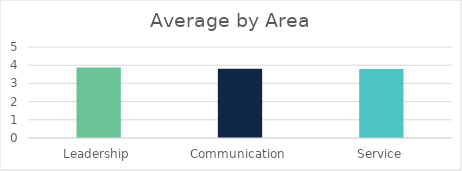
| Category | Series 0 |
|---|---|
| Leadership | 3.88 |
| Communication | 3.81 |
| Service | 3.79 |